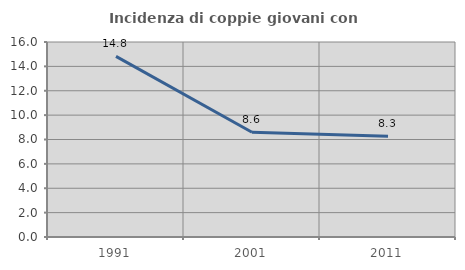
| Category | Incidenza di coppie giovani con figli |
|---|---|
| 1991.0 | 14.822 |
| 2001.0 | 8.593 |
| 2011.0 | 8.261 |